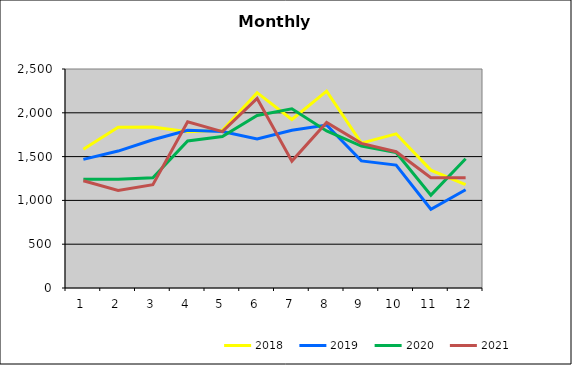
| Category | 2018 | 2019 | 2020 | 2021 |
|---|---|---|---|---|
| 0 | 1584.945 | 1467.961 | 1241.004 | 1224.945 |
| 1 | 1834.566 | 1563.301 | 1241.851 | 1112.955 |
| 2 | 1838.878 | 1692.17 | 1257.948 | 1179.01 |
| 3 | 1785.082 | 1799.954 | 1678.799 | 1897.827 |
| 4 | 1801.761 | 1787.008 | 1728.302 | 1784.624 |
| 5 | 2229.629 | 1700.928 | 1969.438 | 2163.63 |
| 6 | 1923.685 | 1800.379 | 2046.582 | 1448.352 |
| 7 | 2246.519 | 1860.378 | 1792.692 | 1890.688 |
| 8 | 1654.017 | 1451.067 | 1620.398 | 1651.337 |
| 9 | 1760.102 | 1402.587 | 1547.501 | 1555.503 |
| 10 | 1345.712 | 899.124 | 1060.179 | 1259.026 |
| 11 | 1179.594 | 1120.919 | 1476.203 | 1259.461 |